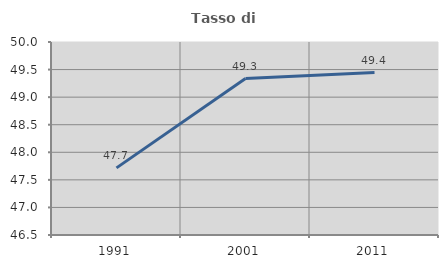
| Category | Tasso di occupazione   |
|---|---|
| 1991.0 | 47.717 |
| 2001.0 | 49.336 |
| 2011.0 | 49.446 |